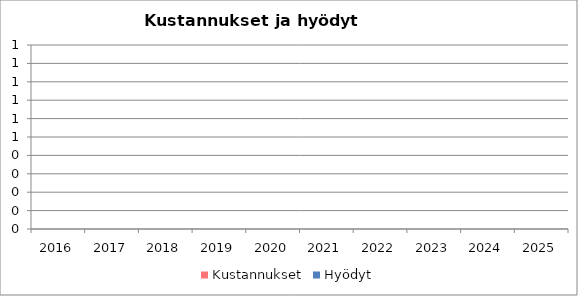
| Category | Kustannukset | Hyödyt |
|---|---|---|
| 2016 | 0 | 0 |
| 2017 | 0 | 0 |
| 2018 | 0 | 0 |
| 2019 | 0 | 0 |
| 2020 | 0 | 0 |
| 2021 | 0 | 0 |
| 2022 | 0 | 0 |
| 2023 | 0 | 0 |
| 2024 | 0 | 0 |
| 2025 | 0 | 0 |